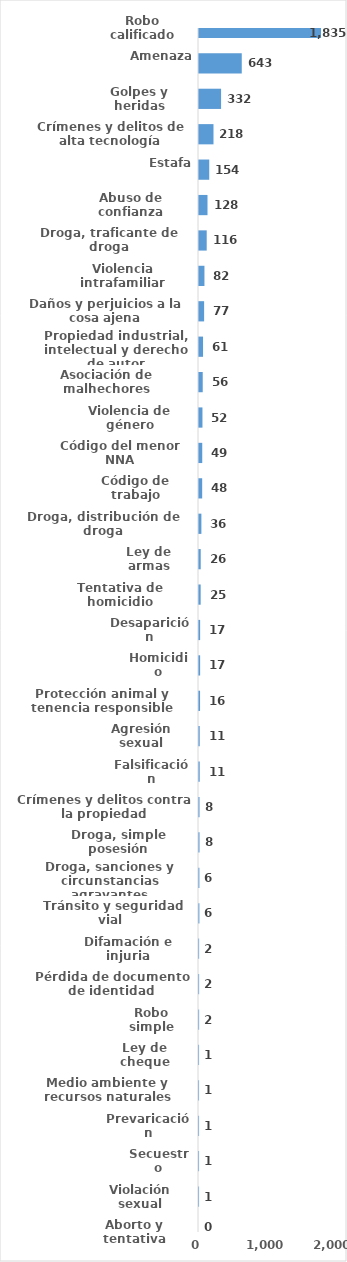
| Category | Series 0 |
|---|---|
| Robo calificado | 1835 |
| Amenaza | 643 |
| Golpes y heridas | 332 |
| Crímenes y delitos de alta tecnología | 218 |
| Estafa | 154 |
| Abuso de confianza | 128 |
| Droga, traficante de droga | 116 |
| Violencia intrafamiliar | 82 |
| Daños y perjuicios a la cosa ajena | 77 |
| Propiedad industrial, intelectual y derecho de autor | 61 |
| Asociación de malhechores | 56 |
| Violencia de género | 52 |
| Código del menor NNA | 49 |
| Código de trabajo | 48 |
| Droga, distribución de droga | 36 |
| Ley de armas | 26 |
| Tentativa de homicidio | 25 |
| Desaparición | 17 |
| Homicidio | 17 |
| Protección animal y tenencia responsible | 16 |
| Agresión sexual | 11 |
| Falsificación | 11 |
| Crímenes y delitos contra la propiedad | 8 |
| Droga, simple posesión | 8 |
| Droga, sanciones y circunstancias agravantes | 6 |
| Tránsito y seguridad vial  | 6 |
| Difamación e injuria | 2 |
| Pérdida de documento de identidad | 2 |
| Robo simple | 2 |
| Ley de cheque | 1 |
| Medio ambiente y recursos naturales | 1 |
| Prevaricación | 1 |
| Secuestro | 1 |
| Violación sexual | 1 |
| Aborto y tentativa | 0 |